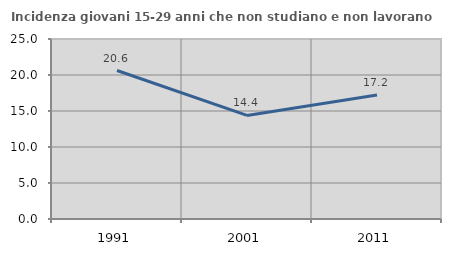
| Category | Incidenza giovani 15-29 anni che non studiano e non lavorano  |
|---|---|
| 1991.0 | 20.624 |
| 2001.0 | 14.386 |
| 2011.0 | 17.216 |